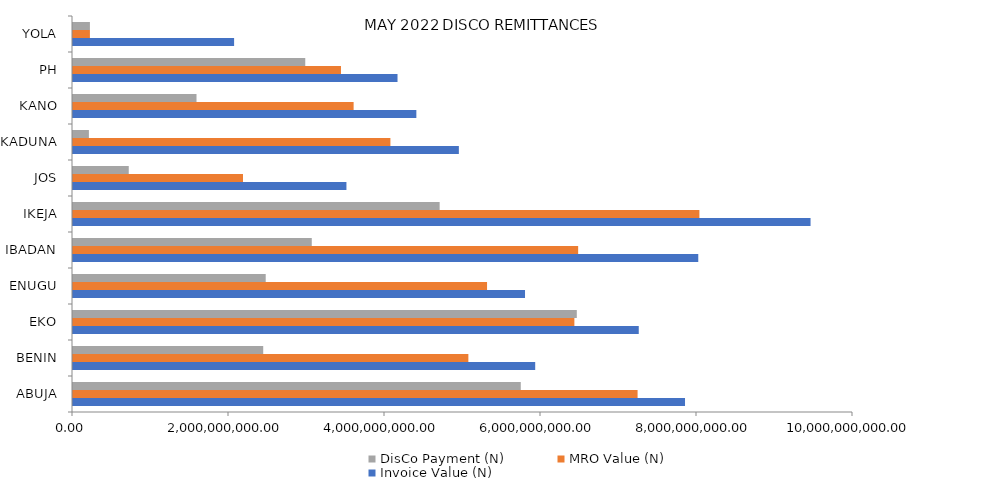
| Category | Invoice Value (N) | MRO Value (N) | DisCo Payment (N) |
|---|---|---|---|
| ABUJA | 7846342615.291 | 7238251062.606 | 5740678402.77 |
| BENIN | 5925666005.084 | 5068814700.749 | 2438698784.99 |
| EKO | 7253294242.034 | 6427869357.291 | 6458937691.89 |
| ENUGU | 5795117654 | 5308327771.064 | 2470706247.97 |
| IBADAN | 8016234308.159 | 6476315697.562 | 3061111408.84 |
| IKEJA | 9455832932.637 | 8030838909.688 | 4700690162.07 |
| JOS | 3505601628.224 | 2179432532.267 | 714763158.54 |
| KADUNA | 4946944951.327 | 4069356916.962 | 203858586.02 |
| KANO | 4401919265.555 | 3597688615.738 | 1583436514.08 |
| PH | 4160463449.211 | 3435710716.359 | 2977781255.85 |
| YOLA | 2065379434.733 | 216864840.647 | 216864840.65 |